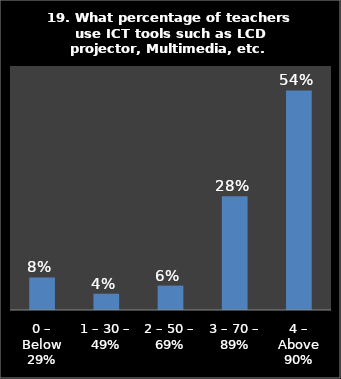
| Category | Series 0 |
|---|---|
| 0 – Below 29% | 0.08 |
| 1 – 30 – 49% | 0.04 |
| 2 – 50 – 69% | 0.06 |
| 3 – 70 – 89% | 0.28 |
| 4 – Above 90% | 0.54 |